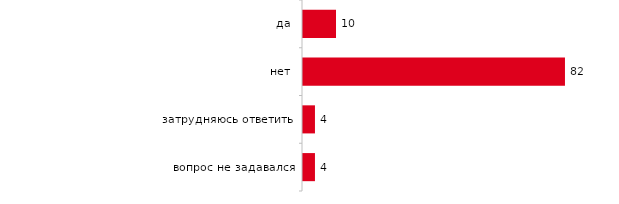
| Category | Series 0 |
|---|---|
| да | 10.35 |
| нет | 82.15 |
| затрудняюсь ответить | 3.75 |
| вопрос не задавался | 3.75 |